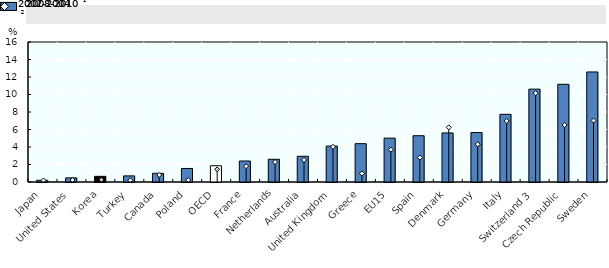
| Category | 2008-2010 |
|---|---|
| Japan | 0.197 |
| United States | 0.471 |
| Korea | 0.648 |
| Turkey | 0.7 |
| Canada | 0.992 |
| Poland | 1.548 |
| OECD | 1.857 |
| France | 2.399 |
| Netherlands | 2.595 |
| Australia | 2.938 |
| United Kingdom | 4.11 |
| Greece | 4.381 |
| EU15 | 5.015 |
| Spain | 5.288 |
| Denmark | 5.606 |
| Germany | 5.651 |
| Italy | 7.736 |
| Switzerland 3 | 10.614 |
| Czech Republic | 11.166 |
| Sweden | 12.577 |